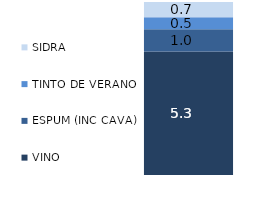
| Category | VINO | ESPUM (INC CAVA) | TINTO DE VERANO | SIDRA |
|---|---|---|---|---|
| 0 | 5.331 | 0.969 | 0.51 | 0.662 |